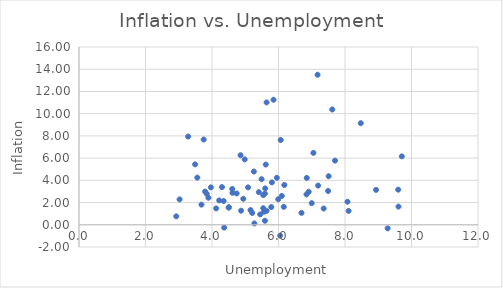
| Category | Series 0 |
|---|---|
| 3.75 | 7.672 |
| 6.05 | -0.981 |
| 5.208333333333333 | 1.064 |
| 3.283333333333333 | 7.941 |
| 3.025 | 2.284 |
| 2.925 | 0.759 |
| 5.591666666666667 | 0.361 |
| 4.366666666666667 | -0.257 |
| 4.125 | 1.474 |
| 4.3 | 3.393 |
| 6.841666666666667 | 2.73 |
| 5.45 | 0.932 |
| 5.541666666666667 | 1.492 |
| 6.691666666666666 | 1.07 |
| 5.566666666666666 | 1.176 |
| 5.641666666666667 | 1.256 |
| 5.158333333333333 | 1.322 |
| 4.508333333333333 | 1.579 |
| 3.7916666666666665 | 2.989 |
| 3.841666666666667 | 2.785 |
| 3.558333333333333 | 4.245 |
| 3.4916666666666667 | 5.437 |
| 4.983333333333333 | 5.884 |
| 5.95 | 4.227 |
| 5.6 | 3.273 |
| 4.858333333333333 | 6.259 |
| 5.641666666666667 | 11.011 |
| 8.475 | 9.142 |
| 7.7 | 5.775 |
| 7.05 | 6.47 |
| 6.066666666666666 | 7.63 |
| 5.85 | 11.253 |
| 7.175 | 13.502 |
| 7.616666666666667 | 10.378 |
| 9.708333333333334 | 6.158 |
| 9.6 | 3.16 |
| 7.508333333333333 | 4.368 |
| 7.191666666666666 | 3.528 |
| 7.0 | 1.944 |
| 6.175 | 3.578 |
| 5.491666666666667 | 4.1 |
| 5.258333333333333 | 4.791 |
| 5.616666666666667 | 5.419 |
| 6.85 | 4.216 |
| 7.491666666666667 | 3.042 |
| 6.908333333333333 | 2.97 |
| 6.1 | 2.596 |
| 5.591666666666667 | 2.805 |
| 5.408333333333333 | 2.937 |
| 4.941666666666666 | 2.338 |
| 4.5 | 1.547 |
| 4.216666666666667 | 2.193 |
| 3.966666666666667 | 3.367 |
| 4.741666666666667 | 2.817 |
| 5.783333333333333 | 1.596 |
| 5.991666666666667 | 2.298 |
| 5.541666666666667 | 2.668 |
| 5.083333333333333 | 3.366 |
| 4.608333333333333 | 3.222 |
| 4.616666666666667 | 2.871 |
| 5.8 | 3.815 |
| 9.283333333333333 | -0.32 |
| 9.608333333333333 | 1.637 |
| 8.933333333333334 | 3.14 |
| 8.075 | 2.073 |
| 7.358333333333333 | 1.466 |
| 6.158333333333333 | 1.615 |
| 5.275 | 0.121 |
| 4.875 | 1.267 |
| 4.35 | 2.137 |
| 3.8916666666666666 | 2.434 |
| 3.683333333333333 | 1.812 |
| 8.108333333333333 | 1.248 |